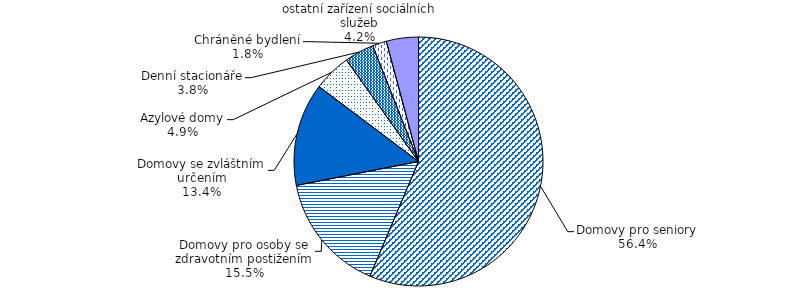
| Category | Series 0 |
|---|---|
| Domovy pro seniory | 2220 |
| Domovy pro osoby se zdravotním postižením | 612 |
| Domovy se zvláštním určením | 526 |
| Azylové domy | 193 |
| Denní stacionáře | 151 |
| Chráněné bydlení | 72 |
| ostatní zařízení sociálních služeb | 164 |